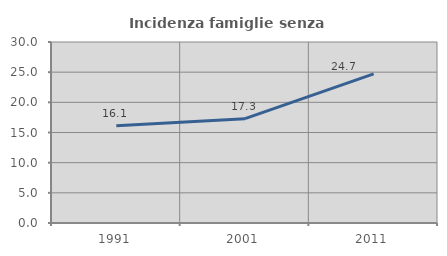
| Category | Incidenza famiglie senza nuclei |
|---|---|
| 1991.0 | 16.131 |
| 2001.0 | 17.289 |
| 2011.0 | 24.714 |